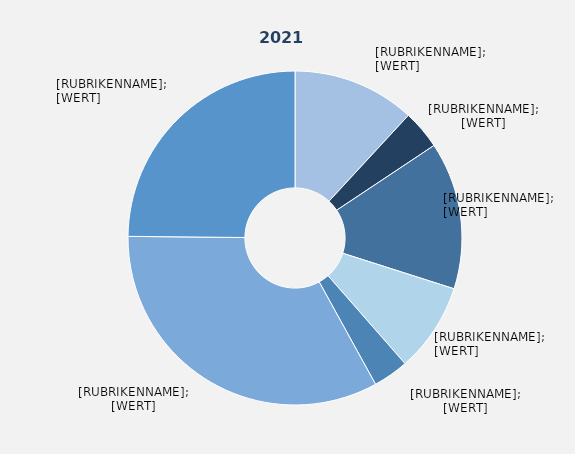
| Category | Series 1 |
|---|---|
| Produzierendes Gewerbe² ohne Baugewerbe | 11.875 |
| Baugewerbe | 3.778 |
| Handel | 14.266 |
| Verkehr und Lagerei | 8.632 |
| Gastgewerbe | 3.437 |
| Erbringung von Unternehmensdienstleistungen | 33.168 |
| Erbringung von öffentlichen und privaten Dienstleistungen | 24.843 |